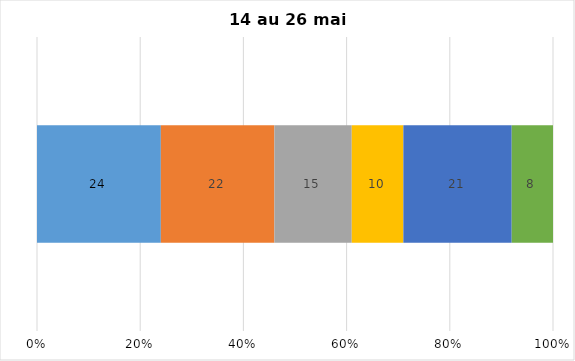
| Category | Plusieurs fois par jour | Une fois par jour | Quelques fois par semaine   | Une fois par semaine ou moins   |  Jamais   |  Je n’utilise pas les médias sociaux |
|---|---|---|---|---|---|---|
| 0 | 24 | 22 | 15 | 10 | 21 | 8 |